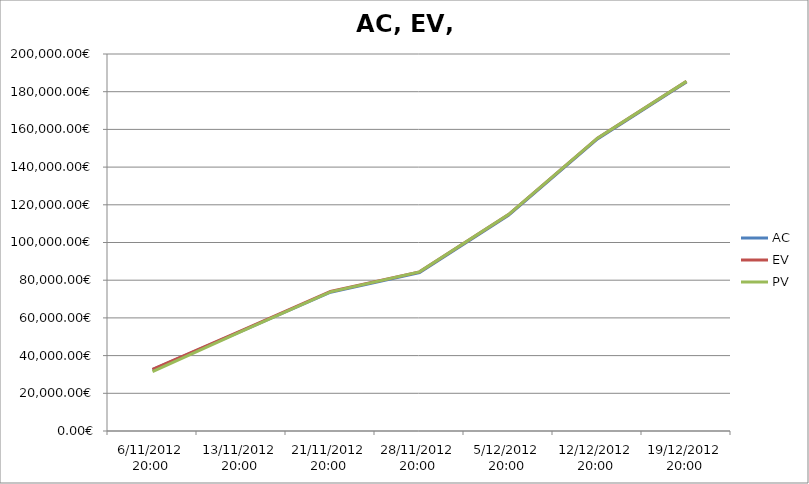
| Category | AC | EV | PV |
|---|---|---|---|
| 6/11/2012 20:00 | 32541.39 | 32739.95 | 31498.18 |
| 13/11/2012 20:00 | 52960.45 | 53191.43 | 52845.68 |
| 21/11/2012 20:00 | 73627.89 | 74020.12 | 73821.87 |
| 28/11/2012 20:00 | 84026.95 | 84425.73 | 84425.73 |
| 5/12/2012 20:00 | 114487.33 | 114844.26 | 114844.26 |
| 12/12/2012 20:00 | 154973.02 | 155339.57 | 155339.57 |
| 19/12/2012 20:00 | 185113.1 | 185472.45 | 185472.45 |